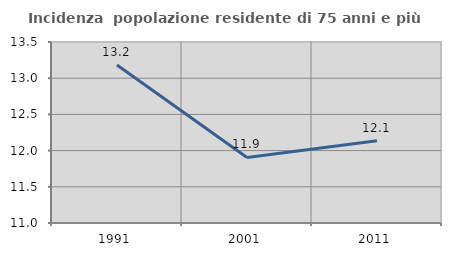
| Category | Incidenza  popolazione residente di 75 anni e più |
|---|---|
| 1991.0 | 13.182 |
| 2001.0 | 11.905 |
| 2011.0 | 12.136 |